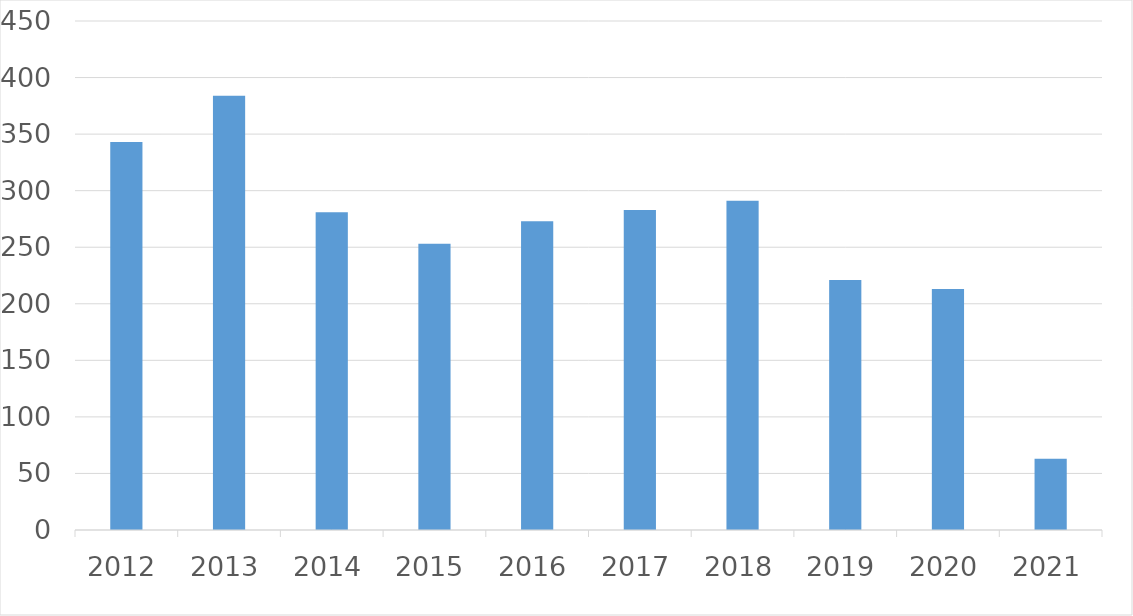
| Category | Series 0 |
|---|---|
| 2012 | 343 |
| 2013 | 384 |
| 2014 | 281 |
| 2015 | 253 |
| 2016 | 273 |
| 2017 | 283 |
| 2018 | 291 |
| 2019 | 221 |
| 2020 | 213 |
| 2021 | 63 |